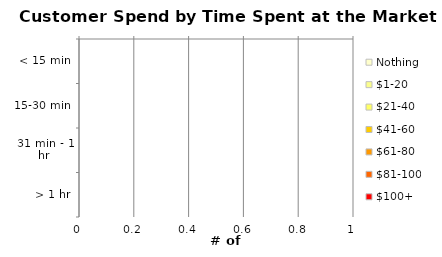
| Category | Nothing | $1-20 | $21-40 | $41-60 | $61-80 | $81-100 | $100+ |
|---|---|---|---|---|---|---|---|
| < 15 min | 0 | 0 | 0 | 0 | 0 | 0 | 0 |
| 15-30 min | 0 | 0 | 0 | 0 | 0 | 0 | 0 |
| 31 min - 1 hr | 0 | 0 | 0 | 0 | 0 | 0 | 0 |
| > 1 hr | 0 | 0 | 0 | 0 | 0 | 0 | 0 |